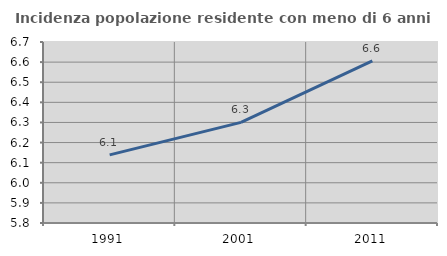
| Category | Incidenza popolazione residente con meno di 6 anni |
|---|---|
| 1991.0 | 6.139 |
| 2001.0 | 6.3 |
| 2011.0 | 6.607 |